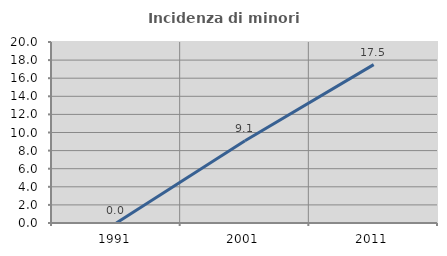
| Category | Incidenza di minori stranieri |
|---|---|
| 1991.0 | 0 |
| 2001.0 | 9.091 |
| 2011.0 | 17.5 |